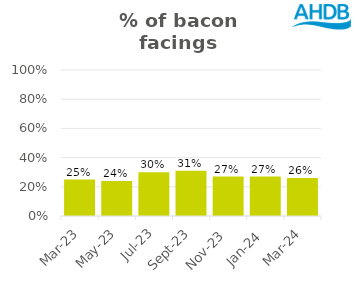
| Category | Bacon |
|---|---|
| 2023-03-01 | 0.25 |
| 2023-05-01 | 0.24 |
| 2023-07-01 | 0.3 |
| 2023-09-01 | 0.31 |
| 2023-11-01 | 0.27 |
| 2024-01-01 | 0.27 |
| 2024-03-01 | 0.26 |